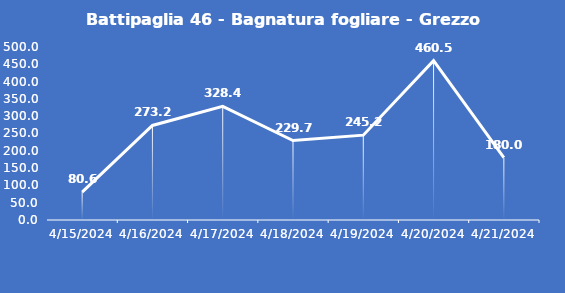
| Category | Battipaglia 46 - Bagnatura fogliare - Grezzo (min) |
|---|---|
| 4/15/24 | 80.6 |
| 4/16/24 | 273.2 |
| 4/17/24 | 328.4 |
| 4/18/24 | 229.7 |
| 4/19/24 | 245.2 |
| 4/20/24 | 460.5 |
| 4/21/24 | 180 |